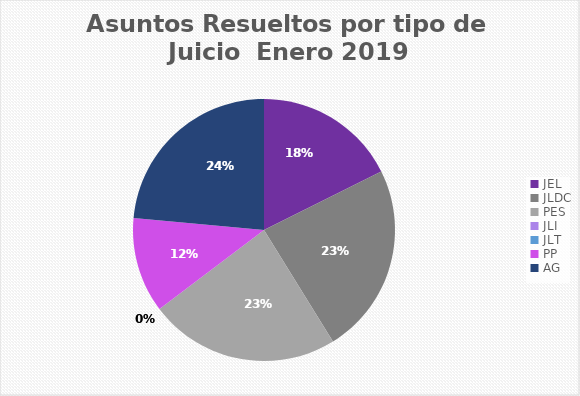
| Category | Asuntos Resueltos por tipo de Juicio  ENERO |
|---|---|
| JEL | 3 |
| JLDC | 4 |
| PES | 4 |
| JLI | 0 |
| JLT | 0 |
| PP | 2 |
| AG | 4 |